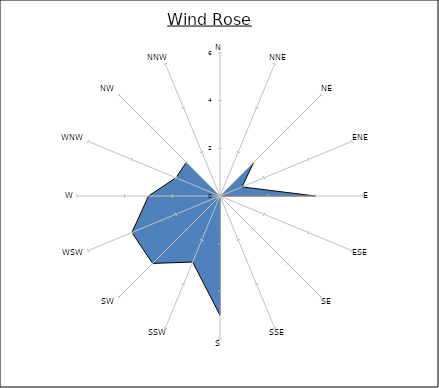
| Category | Series 0 |
|---|---|
| N | 0 |
| NNE | 0 |
| NE | 2 |
| ENE | 1 |
| E | 4 |
| ESE | 0 |
| SE | 0 |
| SSE | 0 |
| S | 5 |
| SSW | 3 |
| SW | 4 |
| WSW | 4 |
| W | 3 |
| WNW | 2 |
| NW | 2 |
| NNW | 0 |